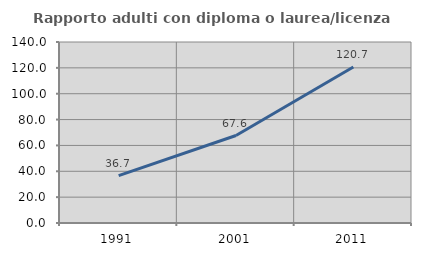
| Category | Rapporto adulti con diploma o laurea/licenza media  |
|---|---|
| 1991.0 | 36.667 |
| 2001.0 | 67.647 |
| 2011.0 | 120.69 |